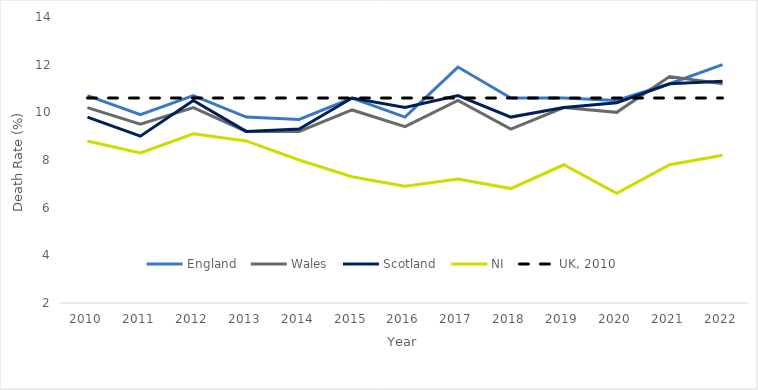
| Category | England | Wales | Scotland | NI | UK, 2010 |
|---|---|---|---|---|---|
| 2010.0 | 10.7 | 10.2 | 9.8 | 8.8 | 10.6 |
| 2011.0 | 9.9 | 9.5 | 9 | 8.3 | 10.6 |
| 2012.0 | 10.7 | 10.2 | 10.5 | 9.1 | 10.6 |
| 2013.0 | 9.8 | 9.2 | 9.2 | 8.8 | 10.6 |
| 2014.0 | 9.7 | 9.2 | 9.3 | 8 | 10.6 |
| 2015.0 | 10.6 | 10.1 | 10.6 | 7.3 | 10.6 |
| 2016.0 | 9.8 | 9.4 | 10.2 | 6.9 | 10.6 |
| 2017.0 | 11.9 | 10.5 | 10.7 | 7.2 | 10.6 |
| 2018.0 | 10.6 | 9.3 | 9.8 | 6.8 | 10.6 |
| 2019.0 | 10.6 | 10.2 | 10.2 | 7.8 | 10.6 |
| 2020.0 | 10.5 | 10 | 10.4 | 6.6 | 10.6 |
| 2021.0 | 11.2 | 11.5 | 11.2 | 7.8 | 10.6 |
| 2022.0 | 12 | 11.2 | 11.3 | 8.2 | 10.6 |